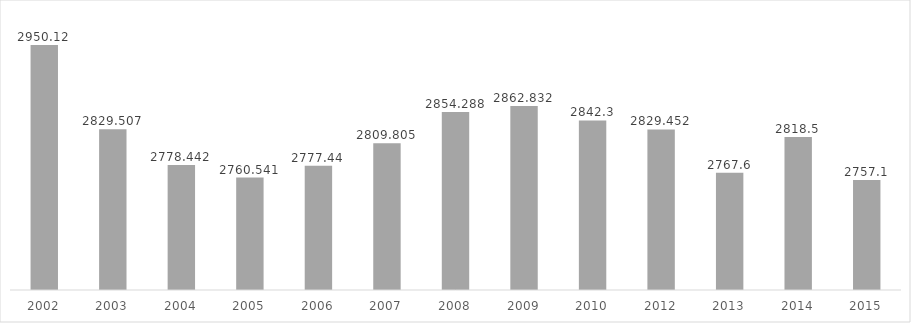
| Category | Samozatrudnieni w wieku 15-64 lat |
|---|---|
| 2002.0 | 2950.12 |
| 2003.0 | 2829.507 |
| 2004.0 | 2778.442 |
| 2005.0 | 2760.541 |
| 2006.0 | 2777.44 |
| 2007.0 | 2809.805 |
| 2008.0 | 2854.288 |
| 2009.0 | 2862.832 |
| 2010.0 | 2842.3 |
| 2012.0 | 2829.452 |
| 2013.0 | 2767.6 |
| 2014.0 | 2818.5 |
| 2015.0 | 2757.1 |